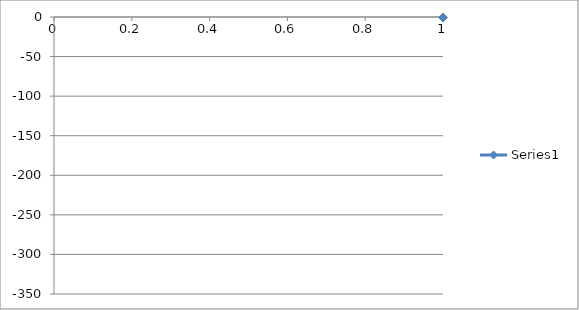
| Category | Series 0 |
|---|---|
| 0 | -0.673 |
| 1 | -0.741 |
| 2 | -0.807 |
| 3 | -0.86 |
| 4 | -0.919 |
| 5 | -0.988 |
| 6 | -1.069 |
| 7 | -1.153 |
| 8 | -1.228 |
| 9 | -1.318 |
| 10 | -1.428 |
| 11 | -1.546 |
| 12 | -1.69 |
| 13 | -1.847 |
| 14 | -2.018 |
| 15 | -2.196 |
| 16 | -2.407 |
| 17 | -2.654 |
| 18 | -2.937 |
| 19 | -3.272 |
| 20 | -3.674 |
| 21 | -4.126 |
| 22 | -4.668 |
| 23 | -5.311 |
| 24 | -6.115 |
| 25 | -7.571 |
| 26 | -8.877 |
| 27 | -10.36 |
| 28 | -12.223 |
| 29 | -15.019 |
| 30 | -18.66 |
| 31 | -20.118 |
| 32 | -21.806 |
| 33 | -23.592 |
| 34 | -26.22 |
| 35 | -28.902 |
| 36 | -31.578 |
| 37 | -34.535 |
| 38 | -38.588 |
| 39 | -42.522 |
| 40 | -46.562 |
| 41 | -51.747 |
| 42 | -56.791 |
| 43 | -63.508 |
| 44 | -70.205 |
| 45 | -77.322 |
| 46 | -85.848 |
| 47 | -94.72 |
| 48 | -104.473 |
| 49 | -114.878 |
| 50 | -125.944 |
| 51 | -137.627 |
| 52 | -149.698 |
| 53 | -162.378 |
| 54 | -175.54 |
| 55 | -188.293 |
| 56 | -201.219 |
| 57 | -213.601 |
| 58 | -226.511 |
| 59 | -238.4 |
| 60 | -249.822 |
| 61 | -260.167 |
| 62 | -269.835 |
| 63 | -278.738 |
| 64 | -287.201 |
| 65 | -294.428 |
| 66 | -300.35 |
| 67 | -306.211 |
| 68 | -310.544 |
| 69 | -314.645 |
| 70 | -317.746 |
| 71 | -320.545 |
| 72 | -322.452 |
| 73 | -324.16 |
| 74 | -325.477 |
| 75 | -326.068 |
| 76 | -326.685 |
| 77 | -327.194 |
| 78 | -327.538 |
| 79 | -327.826 |
| 80 | -327.957 |
| 81 | -328.018 |
| 82 | -327.986 |
| 83 | -327.855 |
| 84 | -327.622 |
| 85 | -327.177 |
| 86 | -326.58 |
| 87 | -325.07 |
| 88 | -323.59 |
| 89 | -321.902 |
| 90 | -319.264 |
| 91 | -316.183 |
| 92 | -312.134 |
| 93 | -307.803 |
| 94 | -302.073 |
| 95 | -296.094 |
| 96 | -288.975 |
| 97 | -280.688 |
| 98 | -272.158 |
| 99 | -262.3 |
| 100 | -251.367 |
| 101 | -240.545 |
| 102 | -228.488 |
| 103 | -216.224 |
| 104 | -203.6 |
| 105 | -190.584 |
| 106 | -177.55 |
| 107 | -164.383 |
| 108 | -151.968 |
| 109 | -139.897 |
| 110 | -127.679 |
| 111 | -116.55 |
| 112 | -106.088 |
| 113 | -96.205 |
| 114 | -87.446 |
| 115 | -79.102 |
| 116 | -71.208 |
| 117 | -64.447 |
| 118 | -58.376 |
| 119 | -52.854 |
| 120 | -47.681 |
| 121 | -43.298 |
| 122 | -39.275 |
| 123 | -35.434 |
| 124 | -32.584 |
| 125 | -29.777 |
| 126 | -27.165 |
| 127 | -24.615 |
| 128 | -22.94 |
| 129 | -21.107 |
| 130 | -19.326 |
| 131 | -15.532 |
| 132 | -12.853 |
| 133 | -11.109 |
| 134 | -9.184 |
| 135 | -7.731 |
| 136 | -7.083 |
| 137 | -6.221 |
| 138 | -5.436 |
| 139 | -4.721 |
| 140 | -4.144 |
| 141 | -3.651 |
| 142 | -3.206 |
| 143 | -2.842 |
| 144 | -2.518 |
| 145 | -2.264 |
| 146 | -2.032 |
| 147 | -1.834 |
| 148 | -1.67 |
| 149 | -1.513 |
| 150 | -1.373 |
| 151 | -1.243 |
| 152 | -1.135 |
| 153 | -1.036 |
| 154 | -0.945 |
| 155 | -0.853 |
| 156 | -0.776 |
| 157 | -0.715 |
| 158 | -0.66 |
| 159 | -0.598 |
| 160 | -0.55 |